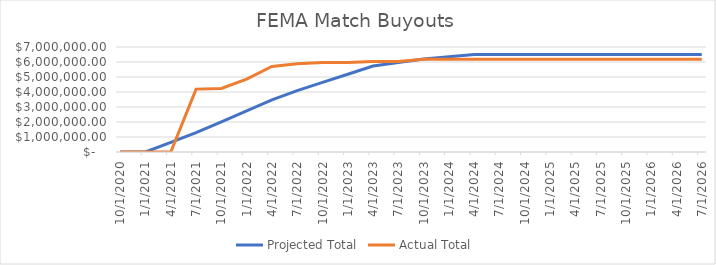
| Category | Projected Total | Actual Total  |
|---|---|---|
| 10/1/20 | 0 | 0 |
| 1/1/21 | 0 | 0 |
| 4/1/21 | 638513.478 | 0 |
| 7/1/21 | 1288116.956 | 4193217 |
| 10/1/21 | 2015196.086 | 4238661 |
| 1/1/22 | 2746597.957 | 4858274 |
| 4/1/22 | 3477999.828 | 5702666 |
| 7/1/22 | 4095453.499 | 5890600 |
| 10/1/22 | 4641106.67 | 5974228 |
| 1/1/23 | 5186759.841 | 5974228 |
| 4/1/23 | 5732413.012 | 6030658 |
| 7/1/23 | 5962623.406 | 6030658 |
| 10/1/23 | 6192833.799 | 6177580.87 |
| 1/1/24 | 6345568.54 | 6185582.54 |
| 4/1/24 | 6493980.54 | 6185582.54 |
| 7/1/24 | 6493980.54 | 6185582.54 |
| 10/1/24 | 6493980.54 | 6185582.54 |
| 1/1/25 | 6493980.54 | 6185582.54 |
| 4/1/25 | 6493980.54 | 6185582.54 |
| 7/1/25 | 6493980.54 | 6185582.54 |
| 10/1/25 | 6493980.54 | 6185582.54 |
| 1/1/26 | 6493980.54 | 6185582.54 |
| 4/1/26 | 6493980.54 | 6185582.54 |
| 7/1/26 | 6493980.54 | 6185582.54 |